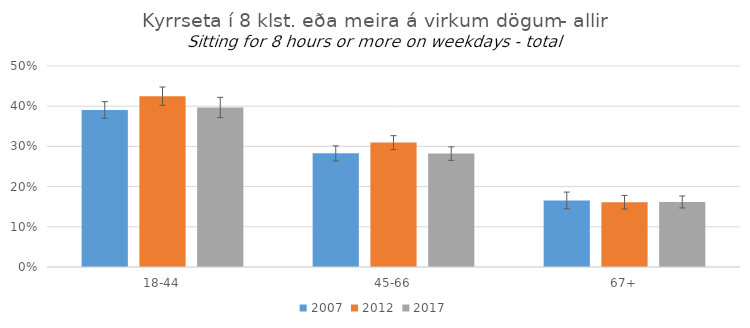
| Category | 2007 | 2012 | 2017 |
|---|---|---|---|
| 18-44 | 0.391 | 0.425 | 0.397 |
| 45-66 | 0.283 | 0.309 | 0.282 |
| 67+ | 0.166 | 0.161 | 0.162 |